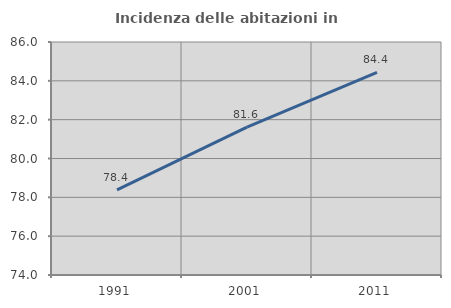
| Category | Incidenza delle abitazioni in proprietà  |
|---|---|
| 1991.0 | 78.386 |
| 2001.0 | 81.616 |
| 2011.0 | 84.438 |